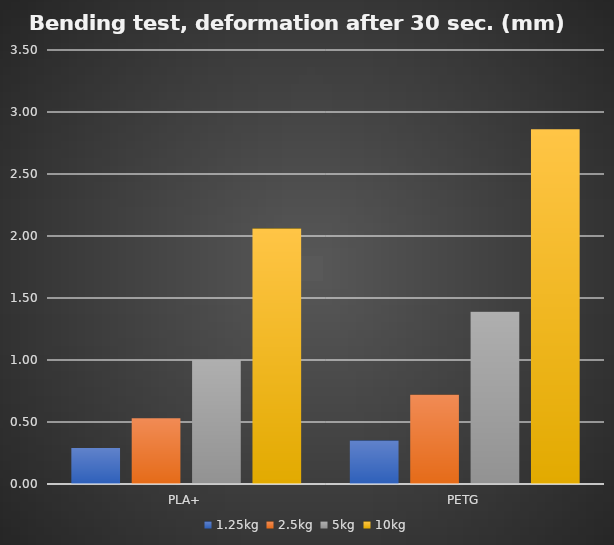
| Category | 1.25kg | 2.5kg | 5kg | 10kg |
|---|---|---|---|---|
| PLA+ | 0.29 | 0.53 | 1 | 2.06 |
| PETG | 0.35 | 0.72 | 1.39 | 2.86 |